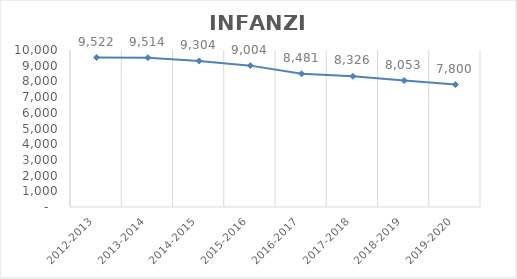
| Category | INFANZIA |
|---|---|
| 2012-2013 | 9522 |
| 2013-2014 | 9514 |
| 2014-2015 | 9304 |
| 2015-2016 | 9004 |
| 2016-2017 | 8481 |
| 2017-2018 | 8326 |
| 2018-2019 | 8053 |
| 2019-2020 | 7800 |